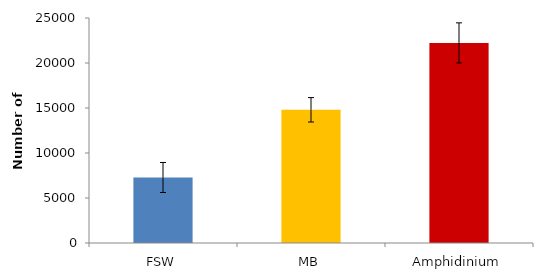
| Category | Series 0 |
|---|---|
| FSW | 7278.677 |
| MB | 14799.361 |
| Amphidinium | 22231.156 |